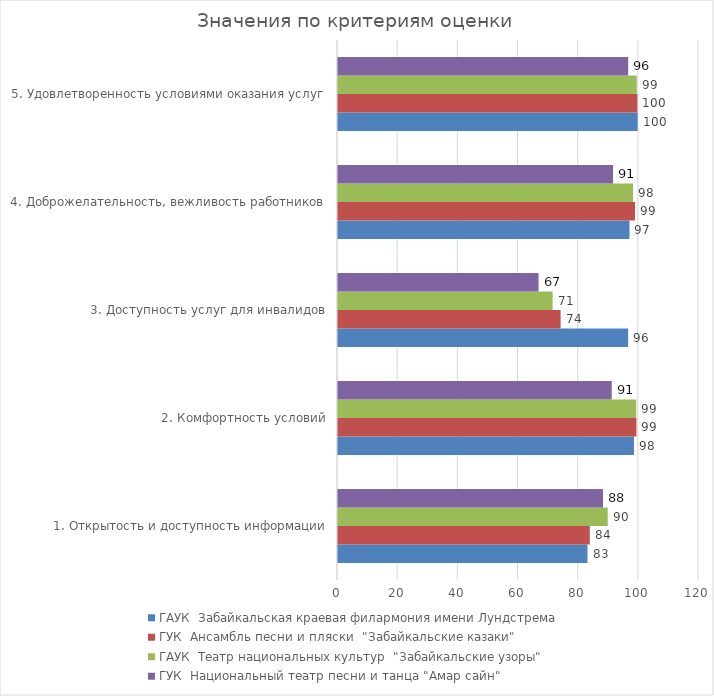
| Category | ГАУК  Забайкальская краевая филармония имени Лундстрема  | ГУК  Ансамбль песни и пляски  "Забайкальские казаки" | ГАУК  Театр национальных культур  "Забайкальские узоры" | ГУК  Национальный театр песни и танца "Амар сайн" |
|---|---|---|---|---|
| 1. Открытость и доступность информации | 82.941 | 83.696 | 89.656 | 88.092 |
| 2. Комфортность условий | 98.382 | 99.205 | 99.137 | 90.995 |
| 3. Доступность услуг для инвалидов | 96.441 | 74 | 71.333 | 66.677 |
| 4. Доброжелательность, вежливость работников | 96.893 | 98.728 | 98.061 | 91.438 |
| 5. Удовлетворенность условиями оказания услуг | 99.612 | 99.507 | 99.323 | 96.461 |